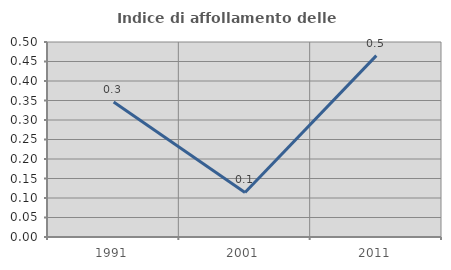
| Category | Indice di affollamento delle abitazioni  |
|---|---|
| 1991.0 | 0.346 |
| 2001.0 | 0.114 |
| 2011.0 | 0.465 |